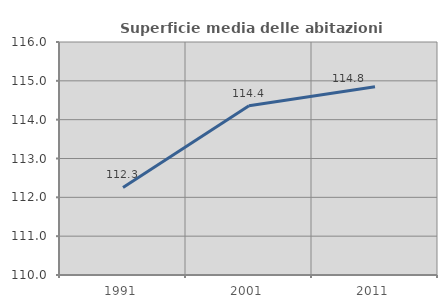
| Category | Superficie media delle abitazioni occupate |
|---|---|
| 1991.0 | 112.254 |
| 2001.0 | 114.359 |
| 2011.0 | 114.848 |